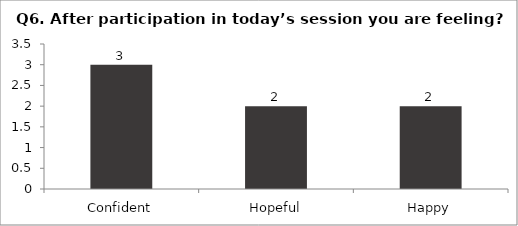
| Category | Q6. After participation in today’s session you are feeling? |
|---|---|
| Confident | 3 |
| Hopeful | 2 |
| Happy | 2 |